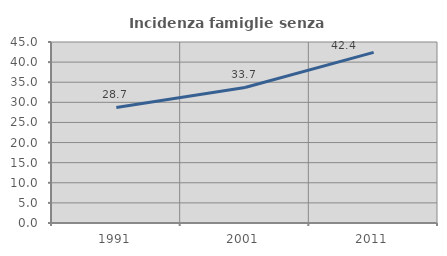
| Category | Incidenza famiglie senza nuclei |
|---|---|
| 1991.0 | 28.736 |
| 2001.0 | 33.705 |
| 2011.0 | 42.432 |